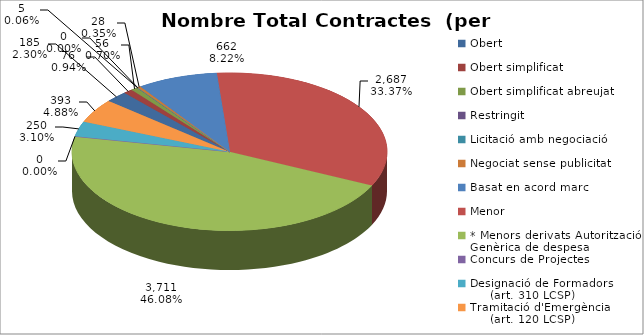
| Category | Nombre Total Contractes |
|---|---|
| Obert | 185 |
| Obert simplificat | 76 |
| Obert simplificat abreujat | 56 |
| Restringit | 5 |
| Licitació amb negociació | 0 |
| Negociat sense publicitat | 28 |
| Basat en acord marc | 662 |
| Menor | 2687 |
| * Menors derivats Autorització Genèrica de despesa | 3711 |
| Concurs de Projectes | 0 |
| Designació de Formadors
     (art. 310 LCSP) | 250 |
| Tramitació d'Emergència
     (art. 120 LCSP) | 393 |